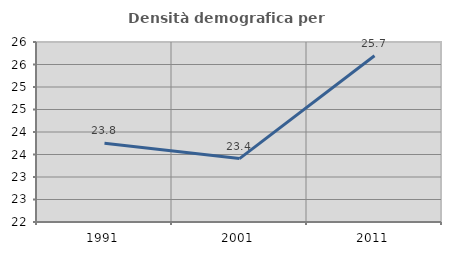
| Category | Densità demografica |
|---|---|
| 1991.0 | 23.752 |
| 2001.0 | 23.41 |
| 2011.0 | 25.693 |